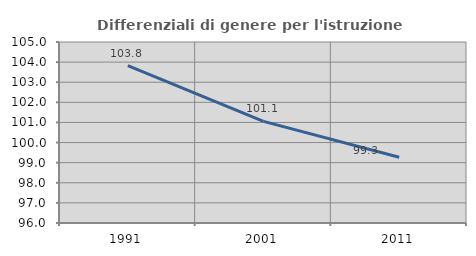
| Category | Differenziali di genere per l'istruzione superiore |
|---|---|
| 1991.0 | 103.821 |
| 2001.0 | 101.051 |
| 2011.0 | 99.266 |